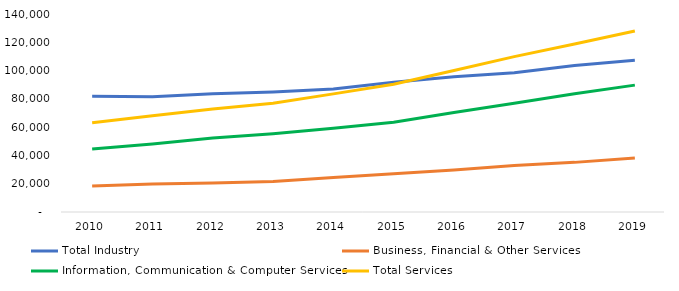
| Category | Total Industry | Business, Financial & Other Services | Information, Communication & Computer Services | Total Services |
|---|---|---|---|---|
| 2010.0 | 81760 | 18426 | 44629 | 63055 |
| 2011.0 | 81537 | 19827 | 48154 | 67981 |
| 2012.0 | 83524 | 20585 | 52253 | 72838 |
| 2013.0 | 84893 | 21493 | 55370 | 76863 |
| 2014.0 | 86992 | 24339 | 59189 | 83528 |
| 2015.0 | 91703 | 26970 | 63426 | 90396 |
| 2016.0 | 95619 | 29624 | 70371 | 99995 |
| 2017.0 | 98402 | 32949 | 76933 | 109882 |
| 2018.0 | 103586 | 35090 | 83634 | 118724 |
| 2019.0 | 107275 | 38267 | 89703 | 127970 |